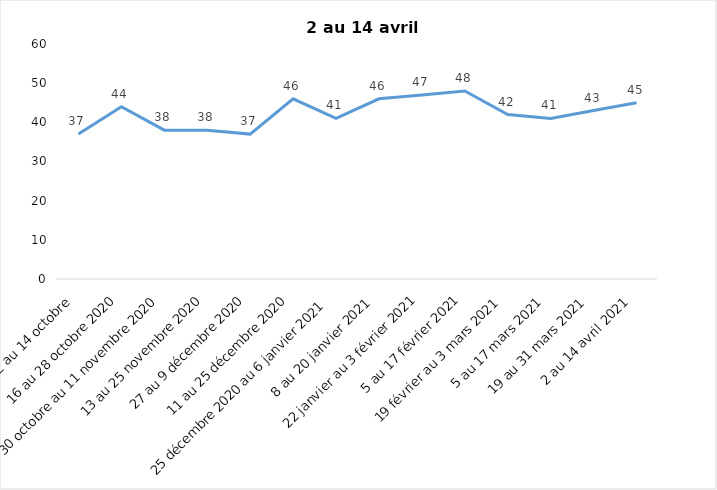
| Category | Toujours aux trois mesures |
|---|---|
| 2 au 14 octobre  | 37 |
| 16 au 28 octobre 2020 | 44 |
| 30 octobre au 11 novembre 2020 | 38 |
| 13 au 25 novembre 2020 | 38 |
| 27 au 9 décembre 2020 | 37 |
| 11 au 25 décembre 2020 | 46 |
| 25 décembre 2020 au 6 janvier 2021 | 41 |
| 8 au 20 janvier 2021 | 46 |
| 22 janvier au 3 février 2021 | 47 |
| 5 au 17 février 2021 | 48 |
| 19 février au 3 mars 2021 | 42 |
| 5 au 17 mars 2021 | 41 |
| 19 au 31 mars 2021 | 43 |
| 2 au 14 avril 2021 | 45 |